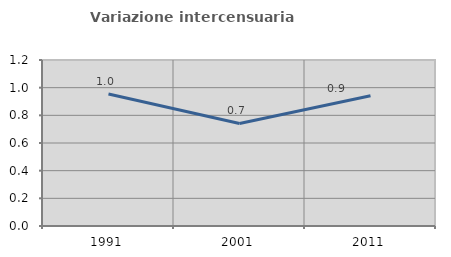
| Category | Variazione intercensuaria annua |
|---|---|
| 1991.0 | 0.954 |
| 2001.0 | 0.741 |
| 2011.0 | 0.941 |